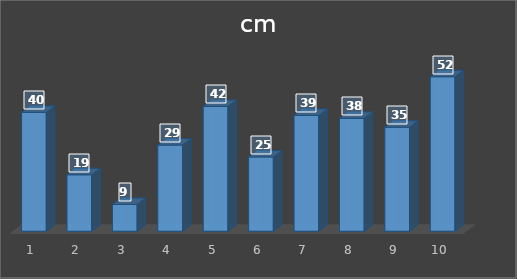
| Category |  cm |
|---|---|
| 0 | 40 |
| 1 | 19 |
| 2 | 9 |
| 3 | 29 |
| 4 | 42 |
| 5 | 25 |
| 6 | 39 |
| 7 | 38 |
| 8 | 35 |
| 9 | 52 |